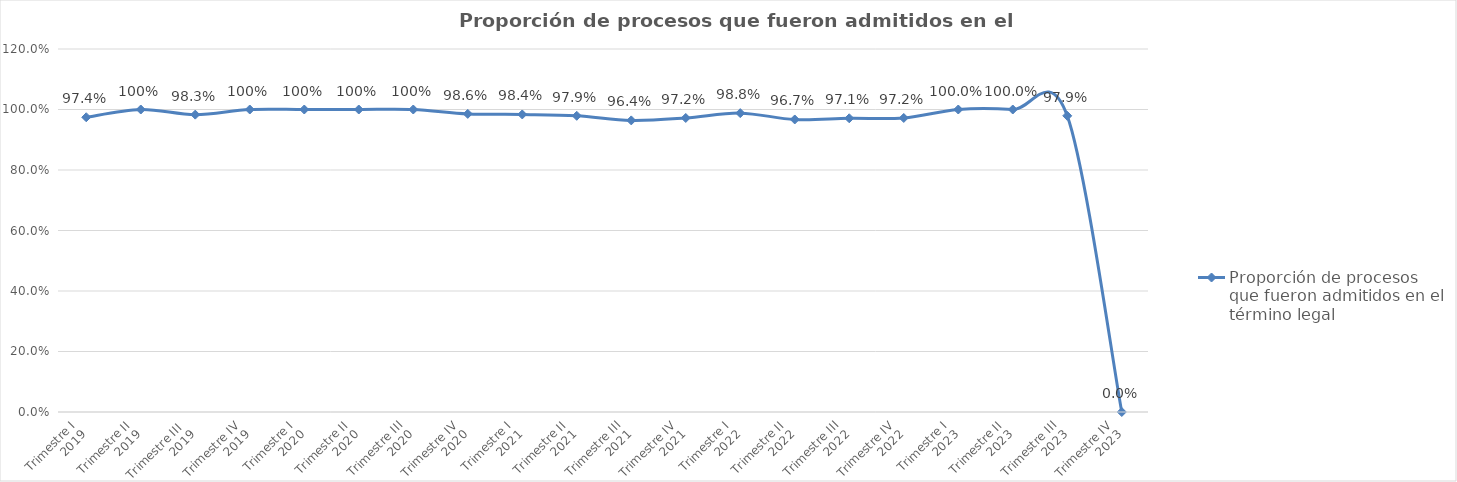
| Category | Proporción de procesos que fueron admitidos en el término legal |
|---|---|
| Trimestre I
2019 | 0.974 |
| Trimestre II
2019 | 1 |
| Trimestre III 
2019 | 0.983 |
| Trimestre IV
2019 | 1 |
| Trimestre I
 2020 | 1 |
| Trimestre II
2020 | 1 |
| Trimestre III
2020 | 1 |
| Trimestre IV
2020 | 0.986 |
| Trimestre I
 2021 | 0.984 |
| Trimestre II
2021 | 0.979 |
| Trimestre III
 2021 | 0.964 |
| Trimestre IV
 2021 | 0.972 |
| Trimestre I
 2022 | 0.988 |
| Trimestre II
2022 | 0.967 |
| Trimestre III
 2022 | 0.971 |
| Trimestre IV
 2022 | 0.972 |
| Trimestre I
 2023 | 1 |
| Trimestre II
2023 | 1 |
| Trimestre III
 2023 | 0.979 |
| Trimestre IV
 2023 | 0 |